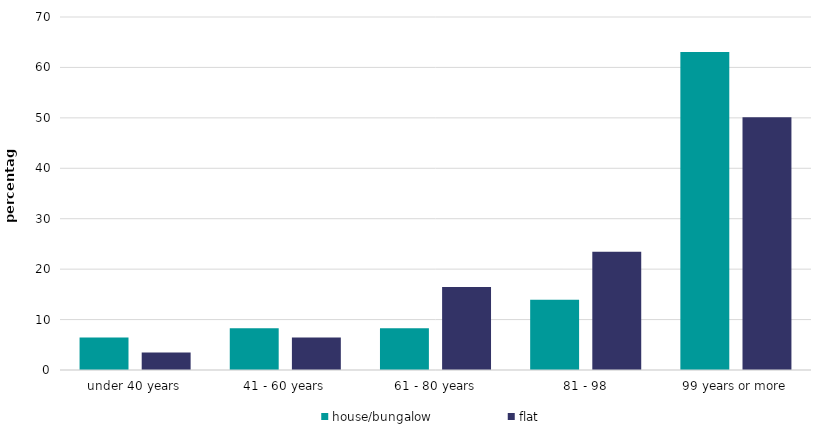
| Category | house/bungalow | flat |
|---|---|---|
| under 40 years | 6.436 | 3.489 |
| 41 - 60 years | 8.255 | 6.463 |
| 61 - 80 years | 8.293 | 16.475 |
| 81 - 98 | 13.955 | 23.452 |
| 99 years or more | 63.061 | 50.121 |